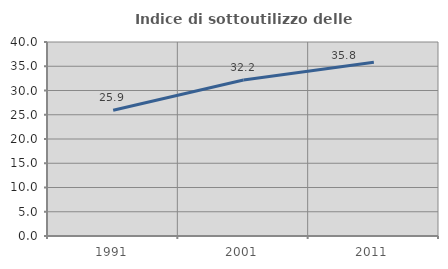
| Category | Indice di sottoutilizzo delle abitazioni  |
|---|---|
| 1991.0 | 25.933 |
| 2001.0 | 32.154 |
| 2011.0 | 35.818 |